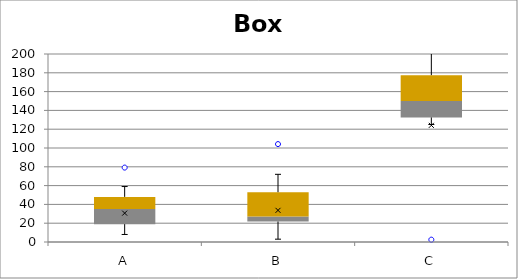
| Category | Min | Q1-Min | Med-Q1 | Q3-Med |
|---|---|---|---|---|
| A | 8 | 11 | 16 | 13 |
| B | 3 | 18.75 | 5.25 | 26 |
| C | 125 | 7.5 | 17.5 | 27.5 |